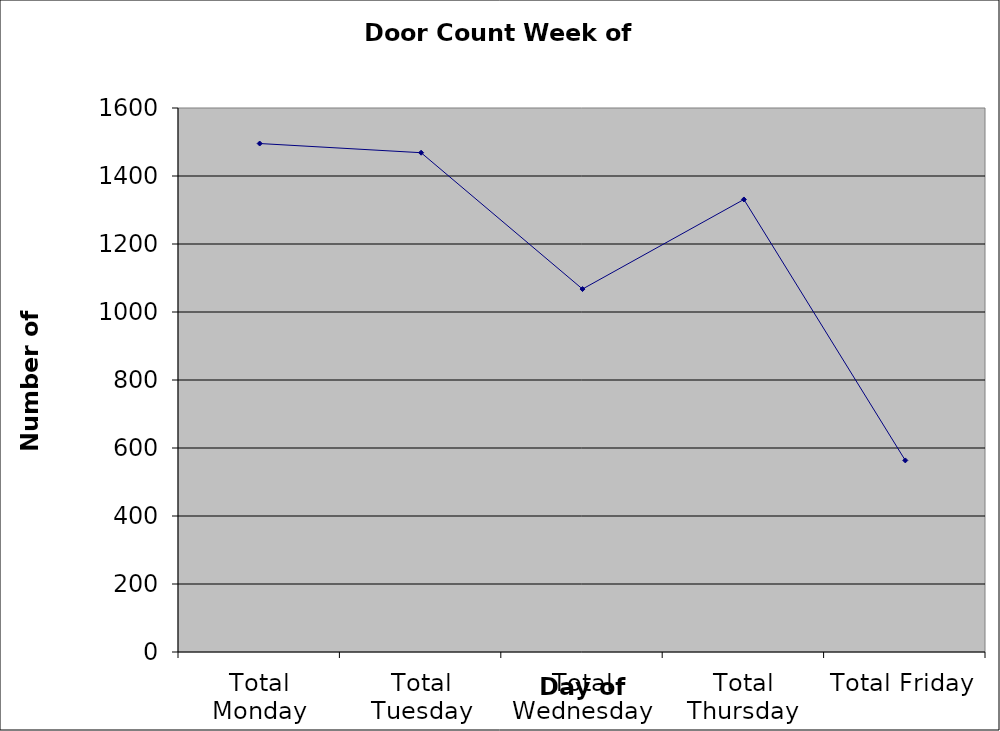
| Category | Series 0 |
|---|---|
| Total Monday | 1495.5 |
| Total Tuesday | 1468.5 |
| Total Wednesday | 1067.5 |
| Total Thursday | 1331 |
| Total Friday | 563.5 |